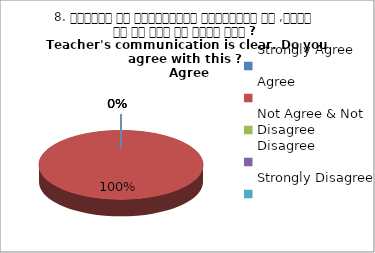
| Category | 8. शिक्षक का सम्प्रेषण सुस्पष्ठ है ,क्या आप इस बात से सहमत हैं ?
Teacher's communication is clear. Do you agree with this ? 
 Agree |
|---|---|
| Strongly Agree | 0 |
| Agree | 1 |
| Not Agree & Not Disagree | 0 |
| Disagree | 0 |
| Strongly Disagree | 0 |